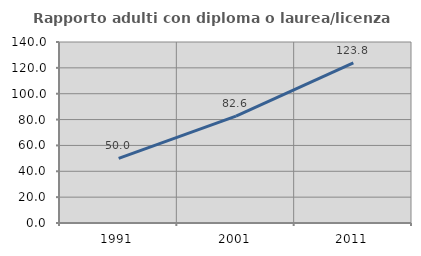
| Category | Rapporto adulti con diploma o laurea/licenza media  |
|---|---|
| 1991.0 | 50 |
| 2001.0 | 82.609 |
| 2011.0 | 123.81 |